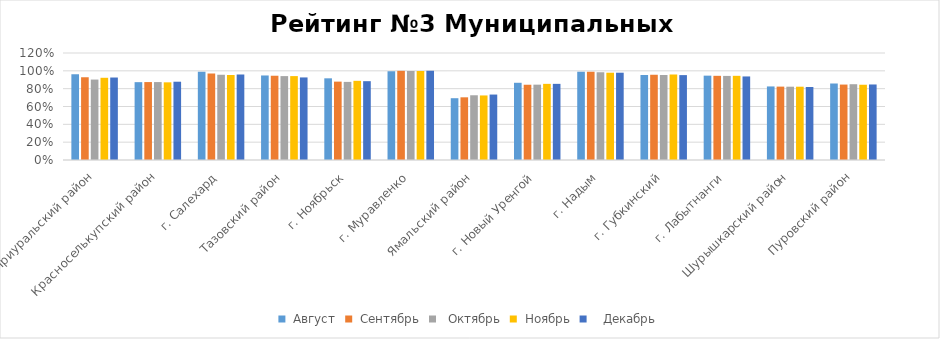
| Category |  Август |  Сентябрь |   Октябрь |  Ноябрь |    Декабрь |
|---|---|---|---|---|---|
| Приуральский район | 0.963 | 0.928 | 0.902 | 0.922 | 0.925 |
| Красноселькупский район | 0.873 | 0.874 | 0.874 | 0.871 | 0.878 |
| г. Салехард | 0.99 | 0.969 | 0.956 | 0.954 | 0.96 |
| Тазовский район | 0.948 | 0.945 | 0.941 | 0.941 | 0.926 |
| г. Ноябрьск | 0.916 | 0.879 | 0.876 | 0.888 | 0.884 |
| г. Муравленко | 0.996 | 1 | 0.999 | 0.999 | 1 |
| Ямальский район | 0.693 | 0.703 | 0.726 | 0.724 | 0.734 |
| г. Новый Уренгой | 0.866 | 0.844 | 0.845 | 0.854 | 0.854 |
| г. Надым | 0.99 | 0.989 | 0.985 | 0.979 | 0.979 |
| г. Губкинский | 0.953 | 0.956 | 0.954 | 0.96 | 0.952 |
| г. Лабытнанги | 0.946 | 0.944 | 0.943 | 0.944 | 0.937 |
| Шурышкарский район | 0.825 | 0.823 | 0.822 | 0.822 | 0.819 |
| Пуровский район | 0.858 | 0.846 | 0.85 | 0.844 | 0.847 |